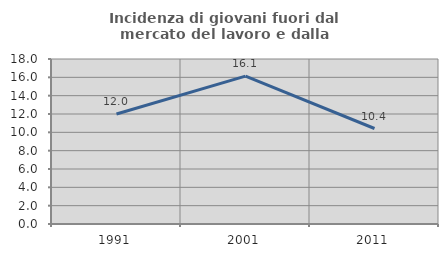
| Category | Incidenza di giovani fuori dal mercato del lavoro e dalla formazione  |
|---|---|
| 1991.0 | 12 |
| 2001.0 | 16.129 |
| 2011.0 | 10.417 |